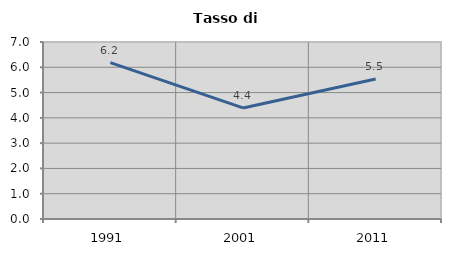
| Category | Tasso di disoccupazione   |
|---|---|
| 1991.0 | 6.186 |
| 2001.0 | 4.392 |
| 2011.0 | 5.539 |